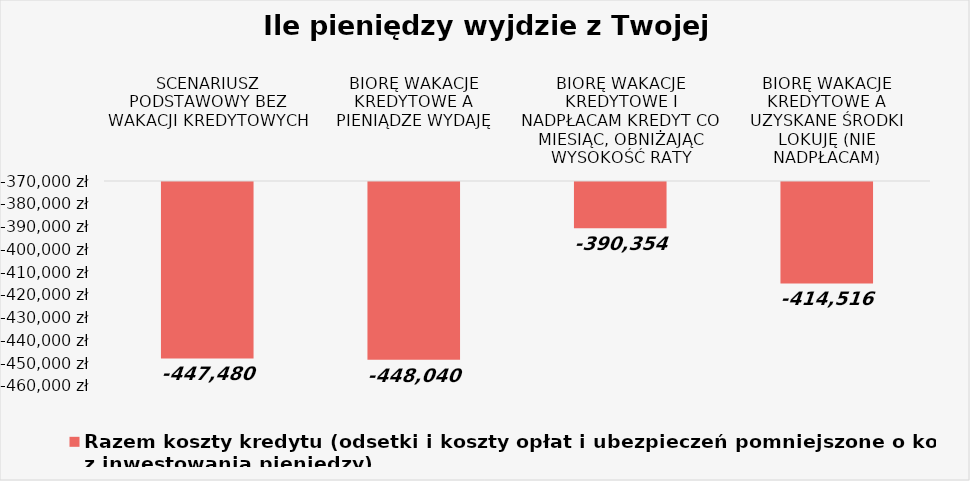
| Category | Razem koszty kredytu (odsetki i koszty opłat i ubezpieczeń pomniejszone o korzyści z inwestowania pieniędzy) |
|---|---|
| SCENARIUSZ PODSTAWOWY BEZ WAKACJI KREDYTOWYCH | -447480.15 |
| BIORĘ WAKACJE KREDYTOWE A PIENIĄDZE WYDAJĘ | -448040.15 |
| BIORĘ WAKACJE KREDYTOWE I NADPŁACAM KREDYT CO MIESIĄC, OBNIŻAJĄC WYSOKOŚĆ RATY | -390353.996 |
| BIORĘ WAKACJE KREDYTOWE A UZYSKANE ŚRODKI LOKUJĘ (NIE NADPŁACAM) | -414516.435 |